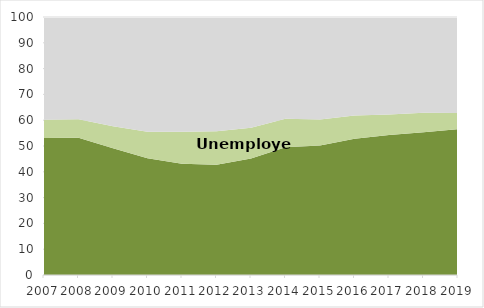
| Category | Employed | Unemployed | Inactive population |
|---|---|---|---|
| 2007.0 | 53.125 | 7.05 | 39.825 |
| 2008.0 | 53.175 | 7.179 | 39.646 |
| 2009.0 | 49.141 | 8.527 | 42.332 |
| 2010.0 | 45.282 | 10.207 | 44.51 |
| 2011.0 | 43.12 | 12.451 | 44.429 |
| 2012.0 | 42.778 | 12.938 | 44.285 |
| 2013.0 | 45.194 | 11.894 | 42.912 |
| 2014.0 | 49.5 | 11.1 | 39.3 |
| 2015.0 | 50.2 | 10.1 | 39.7 |
| 2016.0 | 52.8 | 9 | 38.2 |
| 2017.0 | 54.224 | 8 | 37.792 |
| 2018.0 | 55.354 | 7.5 | 37.148 |
| 2019.0 | 56.564 | 6.2 | 37.271 |